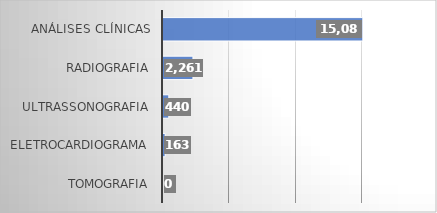
| Category | Series 0 |
|---|---|
| TOMOGRAFIA | 0 |
| ELETROCARDIOGRAMA | 163 |
| ULTRASSONOGRAFIA | 440 |
| RADIOGRAFIA | 2261 |
| ANÁLISES CLÍNICAS | 15082 |